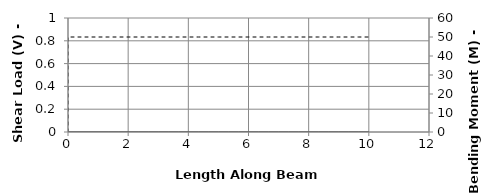
| Category | V |
|---|---|
| 0.0 | 0 |
| 0.0 | 0 |
| 0.3333333333333333 | 0 |
| 0.6666666666666666 | 0 |
| 1.0 | 0 |
| 1.3333333333333333 | 0 |
| 1.6666666666666665 | 0 |
| 2.0 | 0 |
| 2.333333333333333 | 0 |
| 2.6666666666666665 | 0 |
| 3.0 | 0 |
| 3.333333333333333 | 0 |
| 3.6666666666666665 | 0 |
| 4.0 | 0 |
| 4.333333333333333 | 0 |
| 4.666666666666666 | 0 |
| 5.0 | 0 |
| 5.333333333333333 | 0 |
| 5.666666666666666 | 0 |
| 6.0 | 0 |
| 6.333333333333333 | 0 |
| 6.666666666666666 | 0 |
| 7.0 | 0 |
| 7.333333333333333 | 0 |
| 7.666666666666666 | 0 |
| 8.0 | 0 |
| 8.333333333333332 | 0 |
| 8.666666666666666 | 0 |
| 9.0 | 0 |
| 9.333333333333332 | 0 |
| 9.666666666666666 | 0 |
| 10.0 | 0 |
| 10.0 | 0 |
| 10.0 | 0 |